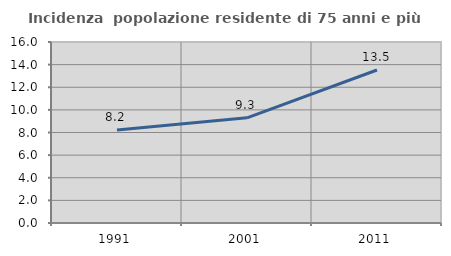
| Category | Incidenza  popolazione residente di 75 anni e più |
|---|---|
| 1991.0 | 8.214 |
| 2001.0 | 9.297 |
| 2011.0 | 13.524 |